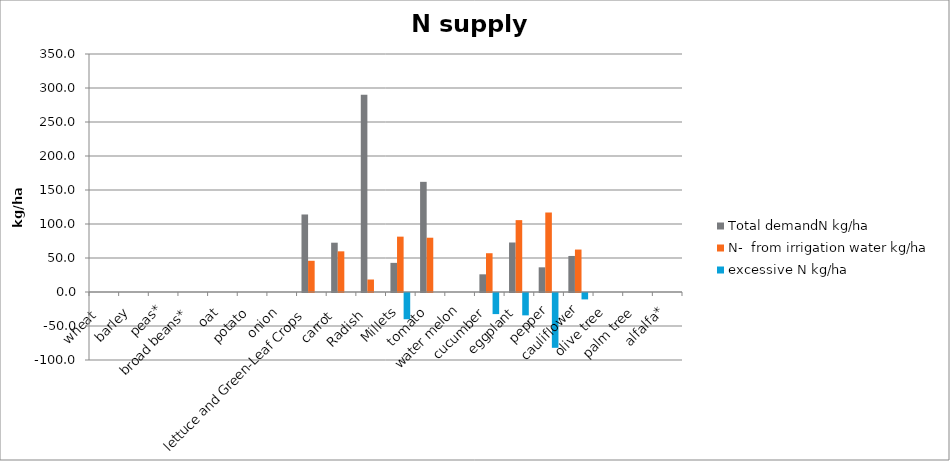
| Category | Total demandN kg/ha | N-  from irrigation water kg/ha | excessive N kg/ha |
|---|---|---|---|
| wheat  | 0 | 0 | 0 |
| barley | 0 | 0 | 0 |
| peas* | 0 | 0 | 0 |
| broad beans* | 0 | 0 | 0 |
| oat | 0 | 0 | 0 |
| potato | 0 | 0 | 0 |
| onion | 0 | 0 | 0 |
| lettuce and Green-Leaf Crops | 114 | 45.9 | 0 |
| carrot  | 72.5 | 59.798 | 0 |
| Radish  | 290 | 18.359 | 0 |
| Millets | 42.84 | 81.404 | -38.564 |
| tomato | 162 | 79.832 | 0 |
| water melon | 0 | 0 | 0 |
| cucumber | 26 | 57.021 | -31.021 |
| eggplant | 72.8 | 105.687 | -32.887 |
| pepper | 36.3 | 116.904 | -80.604 |
| cauliflower | 53 | 62.417 | -9.417 |
| olive tree | 0 | 0 | 0 |
| palm tree | 0 | 0 | 0 |
| alfalfa* | 0 | 0 | 0 |